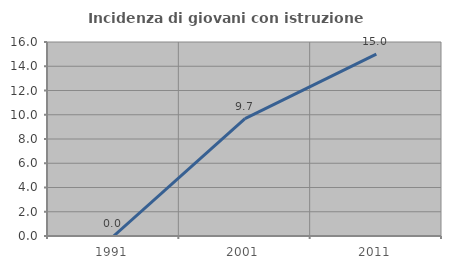
| Category | Incidenza di giovani con istruzione universitaria |
|---|---|
| 1991.0 | 0 |
| 2001.0 | 9.677 |
| 2011.0 | 15 |